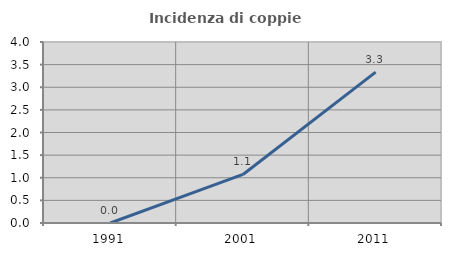
| Category | Incidenza di coppie miste |
|---|---|
| 1991.0 | 0 |
| 2001.0 | 1.073 |
| 2011.0 | 3.333 |